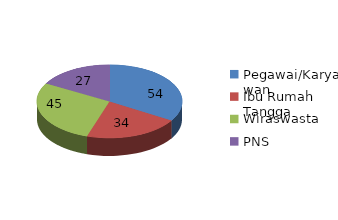
| Category | Series 0 |
|---|---|
| Pegawai/Karyawan | 54 |
| Ibu Rumah Tangga | 34 |
| Wiraswasta | 45 |
| PNS | 27 |